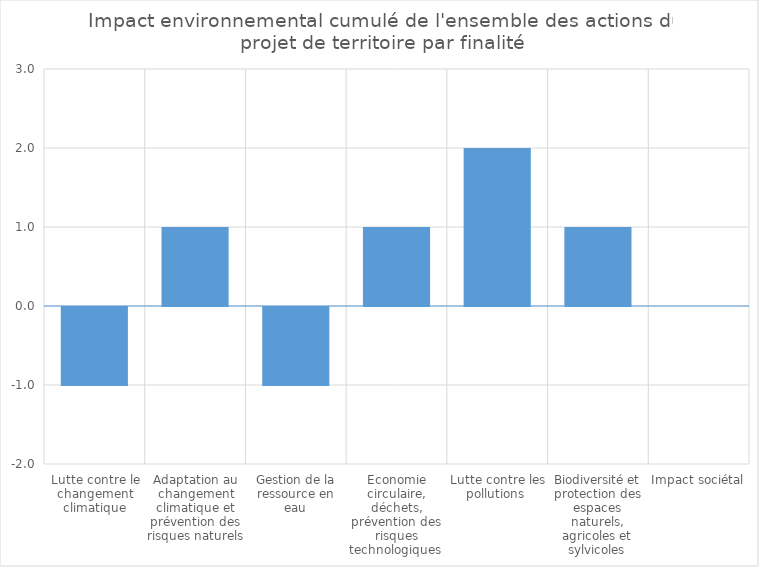
| Category | Series 0 |
|---|---|
| Lutte contre le changement climatique | -1 |
| Adaptation au changement climatique et prévention des risques naturels | 1 |
| Gestion de la ressource en eau | -1 |
| Economie circulaire, déchets, prévention des risques technologiques  | 1 |
| Lutte contre les pollutions  | 2 |
| Biodiversité et protection des espaces naturels, agricoles et sylvicoles | 1 |
| Impact sociétal | 0 |